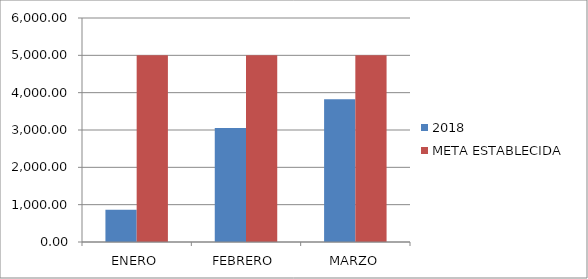
| Category | 2018 | META ESTABLECIDA  |
|---|---|---|
| ENERO | 866.38 | 5000 |
| FEBRERO | 3054.6 | 5000 |
| MARZO | 3822.65 | 5000 |